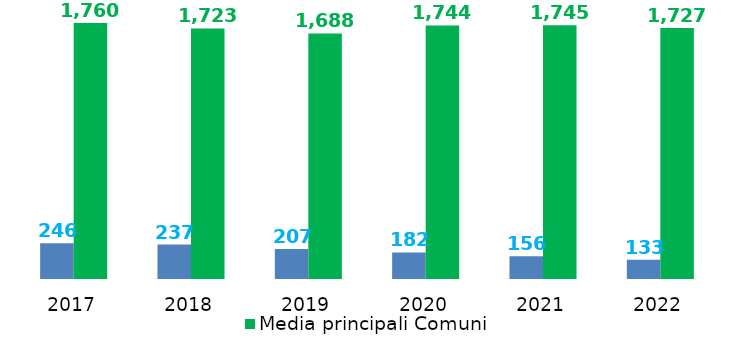
| Category | Indebitamento procapite | Media principali Comuni |
|---|---|---|
| 2017.0 | 245.61 | 1760.222 |
| 2018.0 | 236.7 | 1723.431 |
| 2019.0 | 206.61 | 1688.383 |
| 2020.0 | 182.34 | 1744.019 |
| 2021.0 | 155.93 | 1744.779 |
| 2022.0 | 133.114 | 1726.956 |